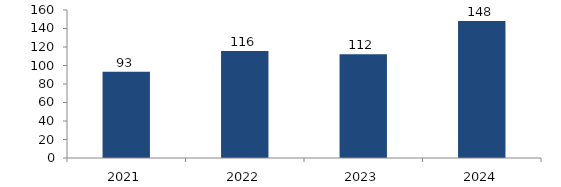
| Category | Bogotá |
|---|---|
| 2021.0 | 93.292 |
| 2022.0 | 115.755 |
| 2023.0 | 112.034 |
| 2024.0 | 148.236 |